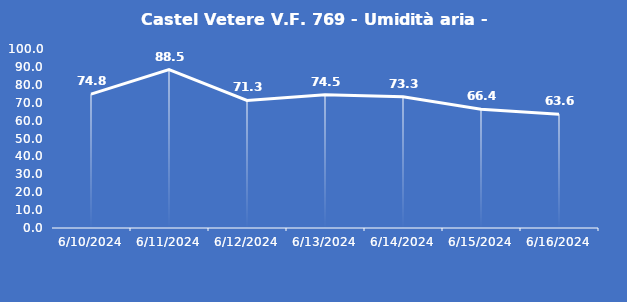
| Category | Castel Vetere V.F. 769 - Umidità aria - Grezzo (%) |
|---|---|
| 6/10/24 | 74.8 |
| 6/11/24 | 88.5 |
| 6/12/24 | 71.3 |
| 6/13/24 | 74.5 |
| 6/14/24 | 73.3 |
| 6/15/24 | 66.4 |
| 6/16/24 | 63.6 |